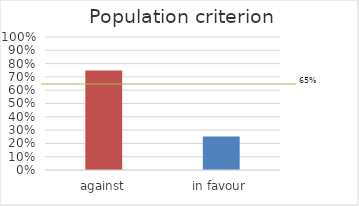
| Category | Population |
|---|---|
| against | 0.749 |
| in favour | 0.251 |